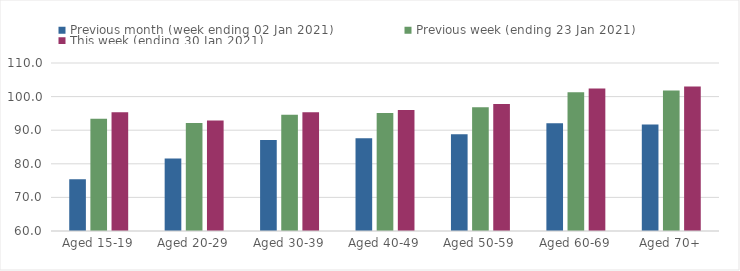
| Category | Previous month (week ending 02 Jan 2021) | Previous week (ending 23 Jan 2021) | This week (ending 30 Jan 2021) |
|---|---|---|---|
| Aged 15-19 | 75.41 | 93.41 | 95.32 |
| Aged 20-29 | 81.61 | 92.11 | 92.88 |
| Aged 30-39 | 87.06 | 94.59 | 95.35 |
| Aged 40-49 | 87.61 | 95.12 | 95.98 |
| Aged 50-59 | 88.76 | 96.86 | 97.81 |
| Aged 60-69 | 92.05 | 101.31 | 102.39 |
| Aged 70+ | 91.69 | 101.78 | 103 |